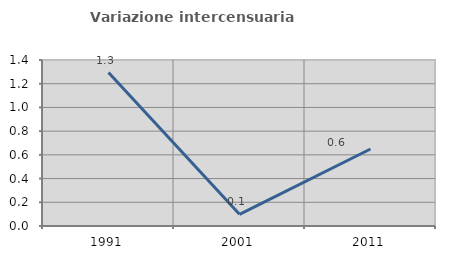
| Category | Variazione intercensuaria annua |
|---|---|
| 1991.0 | 1.294 |
| 2001.0 | 0.099 |
| 2011.0 | 0.649 |